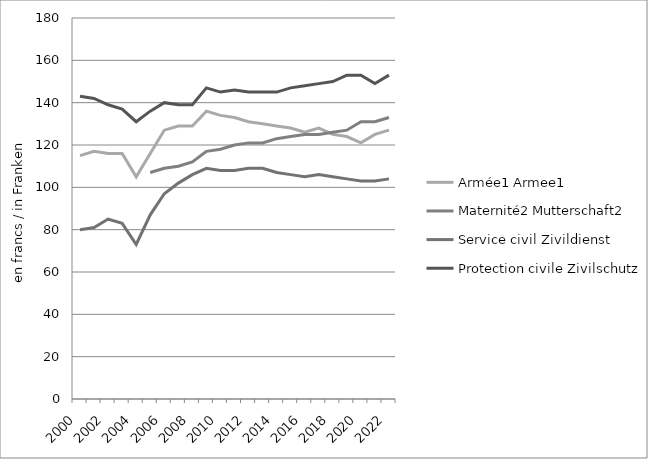
| Category | Armée1 | Maternité2 | Service civil | Protection civile | Paternité3 |
|---|---|---|---|---|---|
| 2000.0 | 115 | 0 | 80 | 143 | 0 |
| 2001.0 | 117 | 0 | 81 | 142 | 0 |
| 2002.0 | 116 | 0 | 85 | 139 | 0 |
| 2003.0 | 116 | 0 | 83 | 137 | 0 |
| 2004.0 | 105 | 0 | 73 | 131 | 0 |
| 2005.0 | 116 | 107 | 87 | 136 | 0 |
| 2006.0 | 127 | 109 | 97 | 140 | 0 |
| 2007.0 | 129 | 110 | 102 | 139 | 0 |
| 2008.0 | 129 | 112 | 106 | 139 | 0 |
| 2009.0 | 136 | 117 | 109 | 147 | 0 |
| 2010.0 | 134 | 118 | 108 | 145 | 0 |
| 2011.0 | 133 | 120 | 108 | 146 | 0 |
| 2012.0 | 131 | 121 | 109 | 145 | 0 |
| 2013.0 | 130 | 121 | 109 | 145 | 0 |
| 2014.0 | 129 | 123 | 107 | 145 | 0 |
| 2015.0 | 128 | 124 | 106 | 147 | 0 |
| 2016.0 | 126 | 125 | 105 | 148 | 0 |
| 2017.0 | 128 | 125 | 106 | 149 | 0 |
| 2018.0 | 125 | 126 | 105 | 150 | 0 |
| 2019.0 | 124 | 127 | 104 | 153 | 0 |
| 2020.0 | 121 | 131 | 103 | 153 | 0 |
| 2021.0 | 125 | 131 | 103 | 149 | 169 |
| 2022.0 | 127 | 133 | 104 | 153 | 170 |